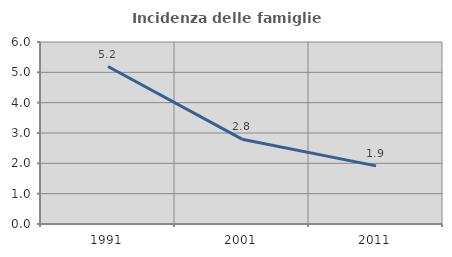
| Category | Incidenza delle famiglie numerose |
|---|---|
| 1991.0 | 5.191 |
| 2001.0 | 2.797 |
| 2011.0 | 1.917 |